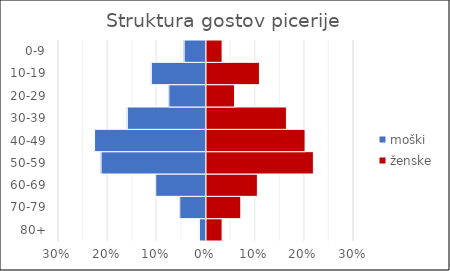
| Category | moški | ženske |
|---|---|---|
| 80+ | -0.013 | 0.034 |
| 70-79 | -0.053 | 0.072 |
| 60-69 | -0.102 | 0.105 |
| 50-59 | -0.213 | 0.219 |
| 40-49 | -0.227 | 0.203 |
| 30-39 | -0.16 | 0.165 |
| 20-29 | -0.076 | 0.059 |
| 10-19 | -0.111 | 0.11 |
| 0-9 | -0.044 | 0.034 |